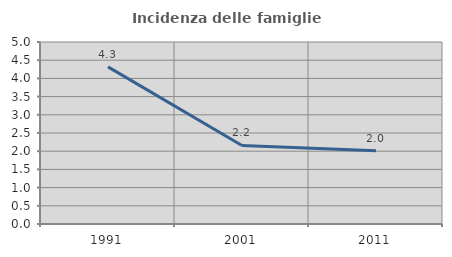
| Category | Incidenza delle famiglie numerose |
|---|---|
| 1991.0 | 4.318 |
| 2001.0 | 2.158 |
| 2011.0 | 2.012 |